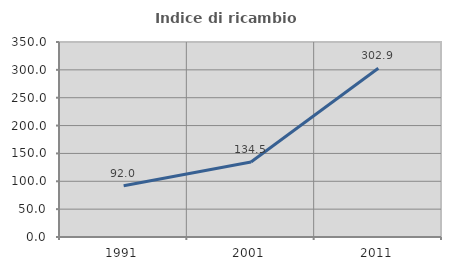
| Category | Indice di ricambio occupazionale  |
|---|---|
| 1991.0 | 91.981 |
| 2001.0 | 134.483 |
| 2011.0 | 302.917 |